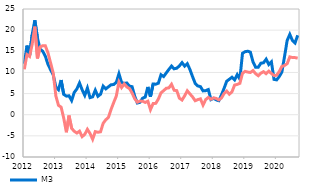
| Category | M3  | Domestic loans to the non-monetary sector |
|---|---|---|
| 2012-01-01 | 12.01 | 10.729 |
| 2012-02-01 | 16.354 | 14.221 |
| 2012-03-01 | 13.992 | 13.782 |
| 2012-04-01 | 18.952 | 16.69 |
| 2012-05-01 | 22.329 | 20.823 |
| 2012-06-01 | 18.134 | 13.296 |
| 2012-07-01 | 15.507 | 16.043 |
| 2012-08-01 | 15.015 | 16.313 |
| 2012-09-01 | 13.837 | 16.292 |
| 2012-10-01 | 11.912 | 14.641 |
| 2012-11-01 | 10.629 | 12.241 |
| 2012-12-01 | 9.421 | 9.834 |
| 2013-01-01 | 6.554 | 4.448 |
| 2013-02-01 | 5.916 | 2.211 |
| 2013-03-01 | 8.196 | 1.791 |
| 2013-04-01 | 4.809 | -0.816 |
| 2013-05-01 | 4.39 | -4.149 |
| 2013-06-01 | 4.482 | -0.203 |
| 2013-07-01 | 3.358 | -3.232 |
| 2013-08-01 | 5.277 | -3.913 |
| 2013-09-01 | 6.108 | -4.338 |
| 2013-10-01 | 7.502 | -3.897 |
| 2013-11-01 | 5.896 | -5.181 |
| 2013-12-01 | 4.573 | -4.65 |
| 2014-01-01 | 6.313 | -3.453 |
| 2014-02-01 | 4.038 | -4.43 |
| 2014-03-01 | 4.234 | -5.804 |
| 2014-04-01 | 5.797 | -3.993 |
| 2014-05-01 | 4.358 | -4.149 |
| 2014-06-01 | 4.845 | -4.035 |
| 2014-07-01 | 6.767 | -2.016 |
| 2014-08-01 | 6.108 | -1.198 |
| 2014-09-01 | 6.605 | -0.64 |
| 2014-10-01 | 7.075 | 1.254 |
| 2014-11-01 | 7.143 | 2.874 |
| 2014-12-01 | 7.648 | 4.423 |
| 2015-01-01 | 9.694 | 7.684 |
| 2015-02-01 | 7.639 | 6.418 |
| 2015-03-01 | 7.404 | 7.278 |
| 2015-04-01 | 7.508 | 6.557 |
| 2015-05-01 | 6.749 | 6.196 |
| 2015-06-01 | 6.629 | 5.14 |
| 2015-07-01 | 4.381 | 3.777 |
| 2015-08-01 | 2.769 | 2.955 |
| 2015-09-01 | 2.936 | 3.226 |
| 2015-10-01 | 3.902 | 3.199 |
| 2015-11-01 | 4.175 | 2.893 |
| 2015-12-01 | 6.564 | 3.196 |
| 2016-01-01 | 4.278 | 1.199 |
| 2016-02-01 | 7.267 | 2.638 |
| 2016-03-01 | 7.218 | 2.687 |
| 2016-04-01 | 7.458 | 3.711 |
| 2016-05-01 | 9.45 | 5.171 |
| 2016-06-01 | 9.03 | 5.69 |
| 2016-07-01 | 9.881 | 6.257 |
| 2016-08-01 | 10.715 | 6.355 |
| 2016-09-01 | 11.496 | 7.196 |
| 2016-10-01 | 10.853 | 5.785 |
| 2016-11-01 | 11.002 | 5.691 |
| 2016-12-01 | 11.553 | 3.906 |
| 2017-01-01 | 12.319 | 3.474 |
| 2017-02-01 | 11.489 | 4.47 |
| 2017-03-01 | 12.067 | 5.654 |
| 2017-04-01 | 10.696 | 4.923 |
| 2017-05-01 | 9.013 | 4.221 |
| 2017-06-01 | 7.423 | 3.312 |
| 2017-07-01 | 6.807 | 3.565 |
| 2017-08-01 | 6.642 | 3.755 |
| 2017-09-01 | 5.632 | 2.278 |
| 2017-10-01 | 5.691 | 3.574 |
| 2017-11-01 | 5.952 | 4.092 |
| 2017-12-01 | 3.567 | 3.671 |
| 2018-01-01 | 3.888 | 3.977 |
| 2018-02-01 | 3.511 | 3.859 |
| 2018-03-01 | 3.318 | 3.502 |
| 2018-04-01 | 4.689 | 3.953 |
| 2018-05-01 | 6.249 | 5.016 |
| 2018-06-01 | 7.929 | 5.586 |
| 2018-07-01 | 8.383 | 4.847 |
| 2018-08-01 | 8.861 | 5.412 |
| 2018-09-01 | 8.24 | 7.016 |
| 2018-10-31 | 9.483 | 7.163 |
| 2018-11-30 | 8.409 | 7.417 |
| 2018-12-31 | 14.522 | 9.795 |
| 2019-01-31 | 14.909 | 10.252 |
| 2019-02-28 | 15.018 | 10.086 |
| 2019-03-31 | 14.797 | 9.982 |
| 2019-04-30 | 12.506 | 10.444 |
| 2019-05-31 | 11.216 | 9.694 |
| 2019-06-30 | 11.23 | 9.224 |
| 2019-07-31 | 12.186 | 9.826 |
| 2019-08-31 | 12.279 | 10.177 |
| 2019-09-30 | 13.127 | 9.697 |
| 2019-10-31 | 11.864 | 10.311 |
| 2019-11-30 | 12.513 | 9.755 |
| 2019-12-31 | 8.354 | 9.245 |
| 2020-01-31 | 8.237 | 9.334 |
| 2020-02-29 | 9.035 | 10.229 |
| 2020-03-31 | 10.113 | 11.424 |
| 2020-04-30 | 13.811 | 11.641 |
| 2020-05-31 | 17.557 | 12.071 |
| 2020-06-30 | 18.995 | 13.679 |
| 2020-07-31 | 17.552 | 13.526 |
| 2020-08-31 | 16.965 | 13.505 |
| 2020-09-30 | 18.779 | 13.379 |